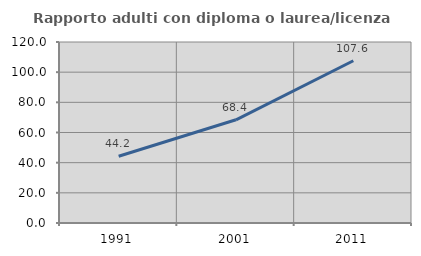
| Category | Rapporto adulti con diploma o laurea/licenza media  |
|---|---|
| 1991.0 | 44.227 |
| 2001.0 | 68.428 |
| 2011.0 | 107.563 |